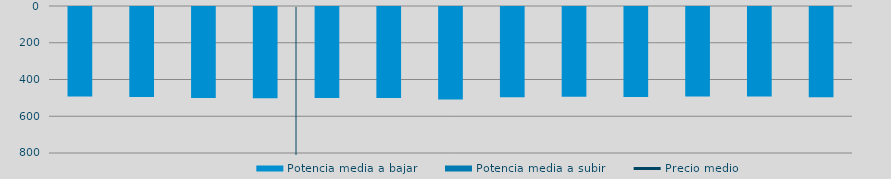
| Category | Potencia media a bajar | Potencia media a subir |
|---|---|---|
| 0 | 487.01 |  |
| 1 | 490.333 |  |
| 2 | 495.342 |  |
| 3 | 496.882 |  |
| 4 | 495.707 |  |
| 5 | 494.878 |  |
| 6 | 503.953 |  |
| 7 | 491.243 |  |
| 8 | 489.099 |  |
| 9 | 489.186 |  |
| 10 | 487.042 |  |
| 11 | 487.609 |  |
| 12 | 490.681 |  |